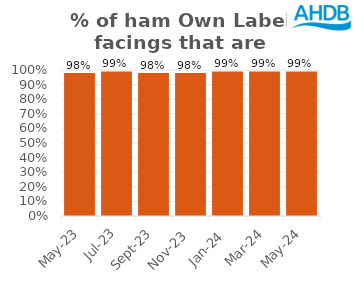
| Category | Ham |
|---|---|
| 2023-05-01 | 0.98 |
| 2023-07-01 | 0.99 |
| 2023-09-01 | 0.98 |
| 2023-11-01 | 0.98 |
| 2024-01-01 | 0.99 |
| 2024-03-01 | 0.99 |
| 2024-05-01 | 0.99 |